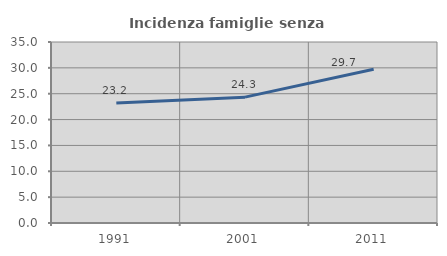
| Category | Incidenza famiglie senza nuclei |
|---|---|
| 1991.0 | 23.226 |
| 2001.0 | 24.334 |
| 2011.0 | 29.744 |